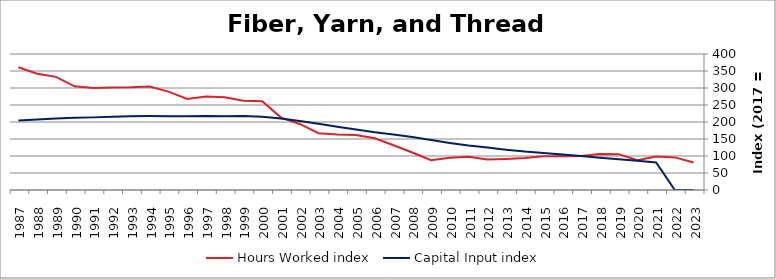
| Category | Hours Worked index | Capital Input index |
|---|---|---|
| 2023.0 | 80.822 | 0 |
| 2022.0 | 95.862 | 0 |
| 2021.0 | 98.229 | 80.741 |
| 2020.0 | 87.688 | 85.71 |
| 2019.0 | 105.406 | 90.504 |
| 2018.0 | 106.029 | 95.002 |
| 2017.0 | 100 | 100 |
| 2016.0 | 98.966 | 104.668 |
| 2015.0 | 98.939 | 108.976 |
| 2014.0 | 94.05 | 112.898 |
| 2013.0 | 91.305 | 118.303 |
| 2012.0 | 89.703 | 124.7 |
| 2011.0 | 97.946 | 130.801 |
| 2010.0 | 94.72 | 138.484 |
| 2009.0 | 87.621 | 147.112 |
| 2008.0 | 110.272 | 155.888 |
| 2007.0 | 131.78 | 163.547 |
| 2006.0 | 152.214 | 169.991 |
| 2005.0 | 161.501 | 177.681 |
| 2004.0 | 163.353 | 186.123 |
| 2003.0 | 166.887 | 195.151 |
| 2002.0 | 194.216 | 203.23 |
| 2001.0 | 212.994 | 210.5 |
| 2000.0 | 261.032 | 215.161 |
| 1999.0 | 262.435 | 217.775 |
| 1998.0 | 273.033 | 216.973 |
| 1997.0 | 275.058 | 217.697 |
| 1996.0 | 267.738 | 216.818 |
| 1995.0 | 289.439 | 217.053 |
| 1994.0 | 304.439 | 217.576 |
| 1993.0 | 302.335 | 216.968 |
| 1992.0 | 301.809 | 215.358 |
| 1991.0 | 299.679 | 213.602 |
| 1990.0 | 304.879 | 212.198 |
| 1989.0 | 332.785 | 210.236 |
| 1988.0 | 341.851 | 207.427 |
| 1987.0 | 360.877 | 204.457 |